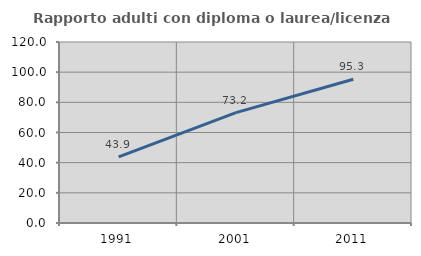
| Category | Rapporto adulti con diploma o laurea/licenza media  |
|---|---|
| 1991.0 | 43.902 |
| 2001.0 | 73.214 |
| 2011.0 | 95.276 |